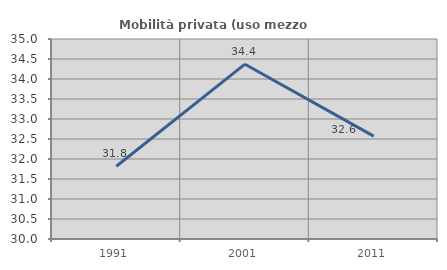
| Category | Mobilità privata (uso mezzo privato) |
|---|---|
| 1991.0 | 31.818 |
| 2001.0 | 34.37 |
| 2011.0 | 32.57 |